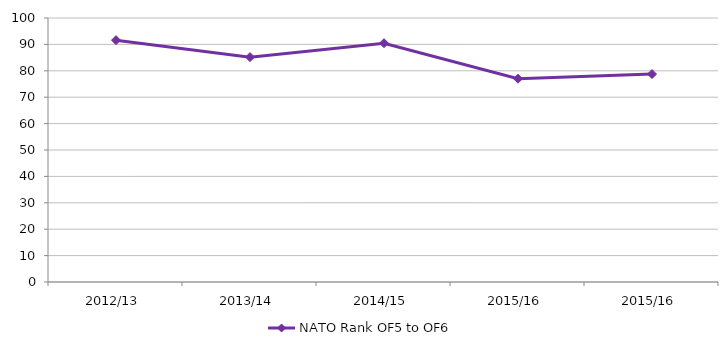
| Category | NATO Rank OF5 to OF6 |
|---|---|
| 2012/13 | 91.601 |
| 2013/14 | 85.182 |
| 2014/15 | 90.456 |
| 2015/16 | 76.996 |
| 2015/16 | 78.77 |